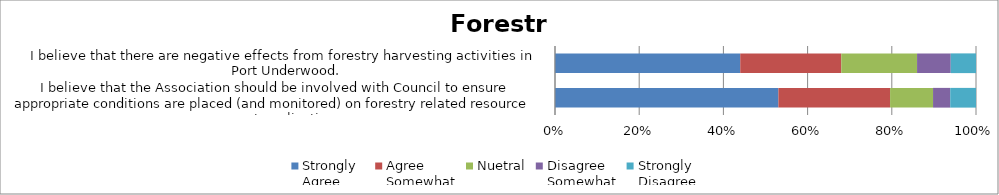
| Category | Strongly
Agree | Agree
Somewhat | Nuetral | Disagree
Somewhat | Strongly
Disagree |
|---|---|---|---|---|---|
| ­I believe that the Association should be involved with Council to ensure appropriate conditions are placed (and monitored) on forestry related resource consent applications. | 26 | 13 | 5 | 2 | 3 |
| `I believe that there are negative effects from forestry harvesting activities in Port Underwood. | 22 | 12 | 9 | 4 | 3 |